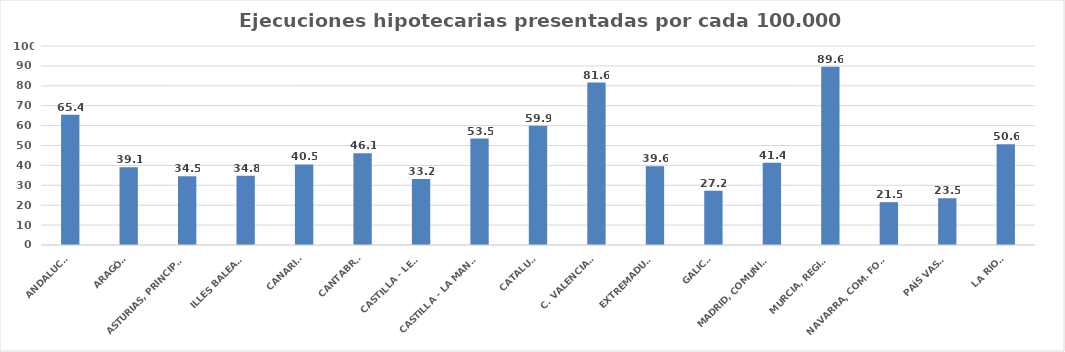
| Category | Series 0 |
|---|---|
| ANDALUCÍA | 65.421 |
| ARAGÓN | 39.131 |
| ASTURIAS, PRINCIPADO | 34.538 |
| ILLES BALEARS | 34.844 |
| CANARIAS | 40.456 |
| CANTABRIA | 46.122 |
| CASTILLA - LEÓN | 33.17 |
| CASTILLA - LA MANCHA | 53.474 |
| CATALUÑA | 59.89 |
| C. VALENCIANA | 81.621 |
| EXTREMADURA | 39.629 |
| GALICIA | 27.244 |
| MADRID, COMUNIDAD | 41.391 |
| MURCIA, REGIÓN | 89.563 |
| NAVARRA, COM. FORAL | 21.532 |
| PAÍS VASCO | 23.504 |
| LA RIOJA | 50.642 |